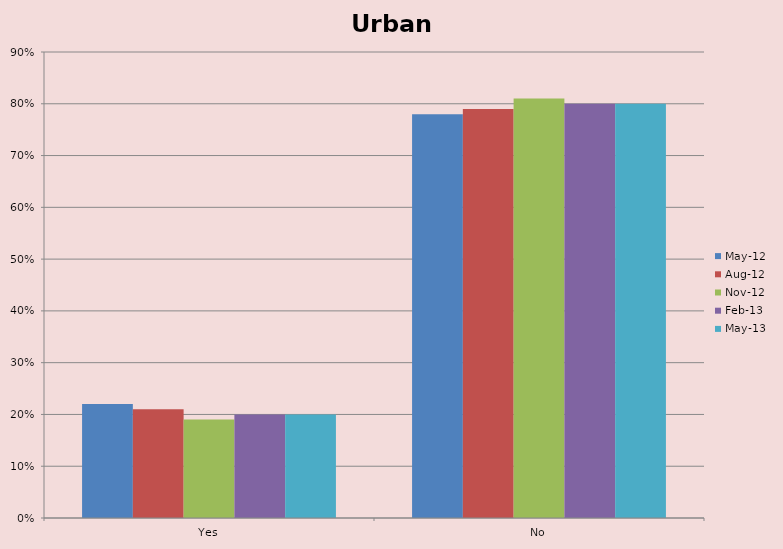
| Category | May-12 | Aug-12 | Nov-12 | Feb-13 | May-13 |
|---|---|---|---|---|---|
| Yes | 0.22 | 0.21 | 0.19 | 0.2 | 0.2 |
| No | 0.78 | 0.79 | 0.81 | 0.8 | 0.8 |